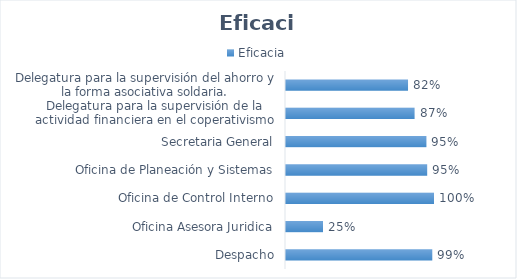
| Category | Eficacia |
|---|---|
| Despacho | 0.988 |
| Oficina Asesora Juridica | 0.25 |
| Oficina de Control Interno | 1 |
| Oficina de Planeación y Sistemas | 0.954 |
| Secretaria General | 0.949 |
| Delegatura para la supervisión de la actividad financiera en el coperativismo | 0.869 |
| Delegatura para la supervisión del ahorro y la forma asociativa soldaria. | 0.825 |